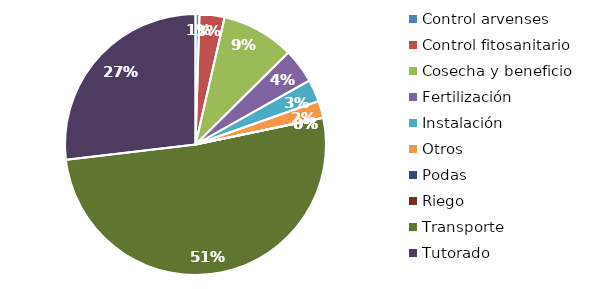
| Category | Valor |
|---|---|
| Control arvenses | 105736 |
| Control fitosanitario | 675930 |
| Cosecha y beneficio | 1962914.974 |
| Fertilización | 935788 |
| Instalación | 601228.503 |
| Otros | 457556 |
| Podas | 0 |
| Riego | 0 |
| Transporte | 11229856 |
| Tutorado | 5868155 |